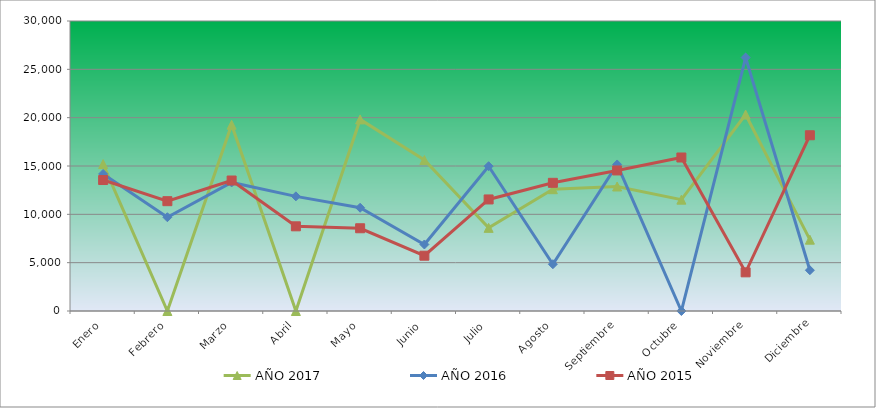
| Category | AÑO 2017 | AÑO 2016 | AÑO 2015 |
|---|---|---|---|
| Enero | 15200 | 14180 | 13550 |
| Febrero | 0 | 9700 | 11360 |
| Marzo | 19270 | 13300 | 13500 |
| Abril | 0 | 11860 | 8760 |
| Mayo | 19820 | 10680 | 8560 |
| Junio | 15620 | 6880 | 5720 |
| Julio | 8600 | 14980 | 11540 |
| Agosto | 12600 | 4840 | 13260 |
| Septiembre | 12880 | 15160 | 14540 |
| Octubre | 11520 | 0 | 15880 |
| Noviembre | 20320 | 26220 | 4000 |
| Diciembre | 7380 | 4220 | 18180 |